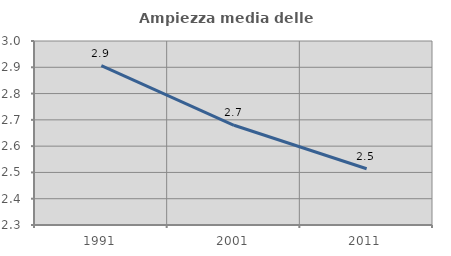
| Category | Ampiezza media delle famiglie |
|---|---|
| 1991.0 | 2.906 |
| 2001.0 | 2.679 |
| 2011.0 | 2.514 |